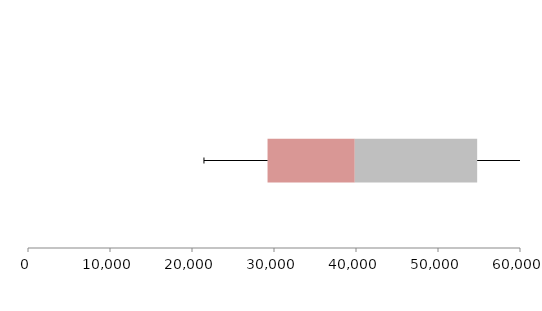
| Category | Series 1 | Series 2 | Series 3 |
|---|---|---|---|
| 0 | 29212.245 | 10639.397 | 14924.01 |